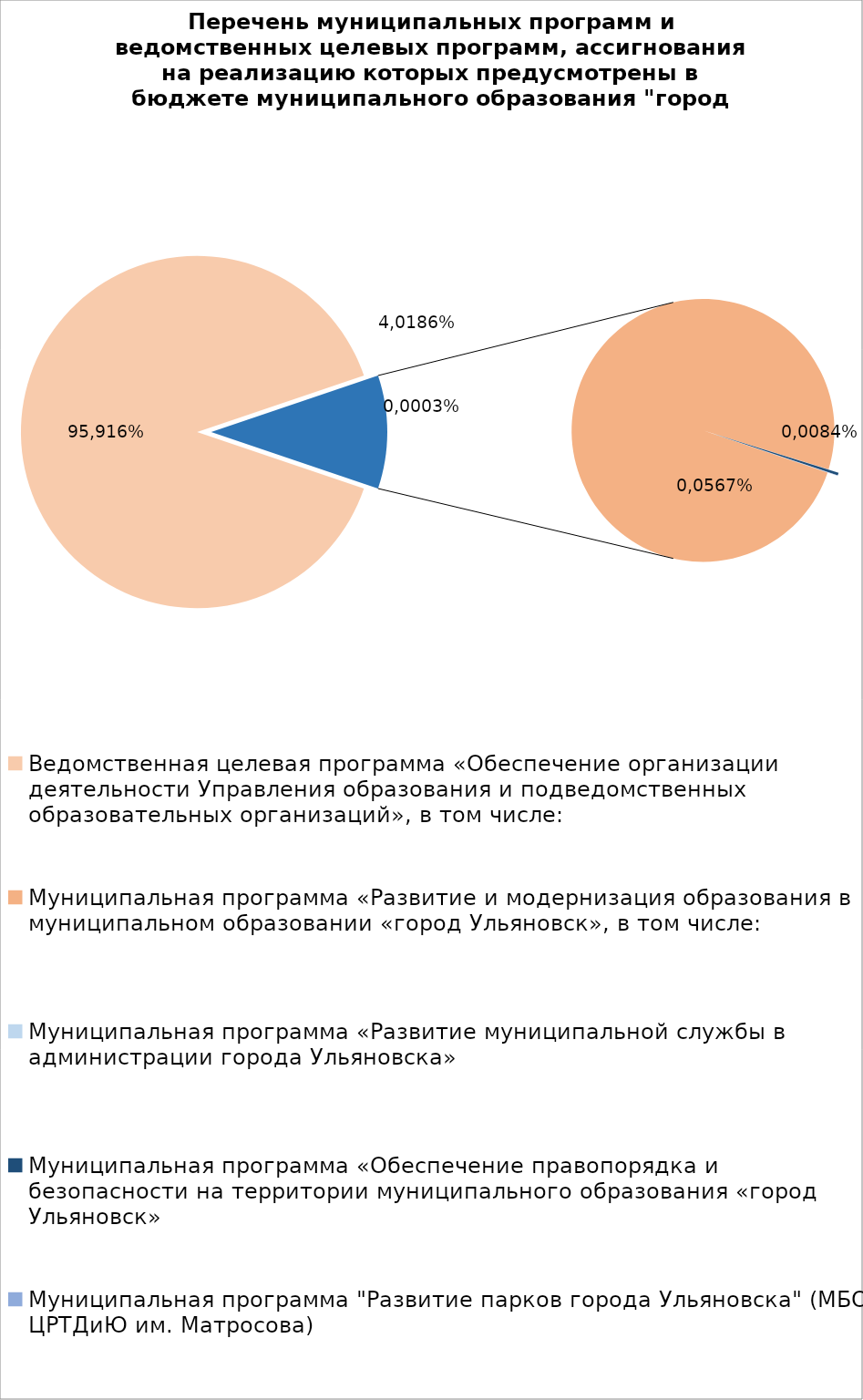
| Category | Series 0 |
|---|---|
| Ведомственная целевая программа «Обеспечение организации деятельности Управления образования и подведомственных образовательных организаций», в том числе: | 6903419.23 |
| Муниципальная программа «Развитие и модернизация образования в муниципальном образовании «город Ульяновск», в том числе: | 797387.91 |
| Муниципальная программа «Развитие муниципальной службы в администрации города Ульяновска» | 14.3 |
| Муниципальная программа «Обеспечение правопорядка и безопасности на территории муниципального образования «город Ульяновск» | 2700 |
| Муниципальная программа "Развитие парков города Ульяновска" (МБОУ ЦРТДиЮ им. Матросова) | 400 |